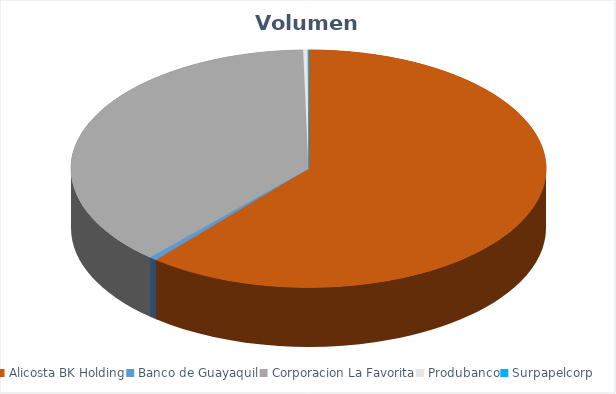
| Category | VOLUMEN ($USD) |
|---|---|
| Alicosta BK Holding | 92450 |
| Banco de Guayaquil | 780.67 |
| Corporacion La Favorita | 57569.6 |
| Produbanco | 461.97 |
| Surpapelcorp | 85 |